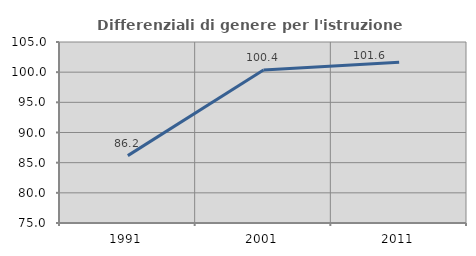
| Category | Differenziali di genere per l'istruzione superiore |
|---|---|
| 1991.0 | 86.166 |
| 2001.0 | 100.359 |
| 2011.0 | 101.641 |